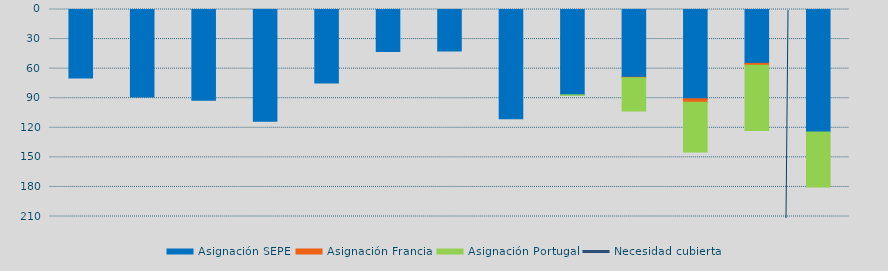
| Category | Asignación SEPE | Asignación Francia | Asignación Portugal |
|---|---|---|---|
| E | 69610 | 0 | 0 |
| F | 88701.8 | 0 | 0 |
| M | 91958.7 | 0 | 0 |
| A | 113400 | 0 | 0 |
| M | 74600 | 0 | 0 |
| J | 42509 | 0 | 0 |
| J | 42214 | 0 | 0 |
| A | 110725 | 0 | 0 |
| S | 86576 | 0 | 437 |
| O | 68790.4 | 478.1 | 33750 |
| N | 90630.9 | 3513 | 50471 |
| D | 54674.4 | 1882.3 | 66113.3 |
| E | 124168 | 0 | 55888.5 |